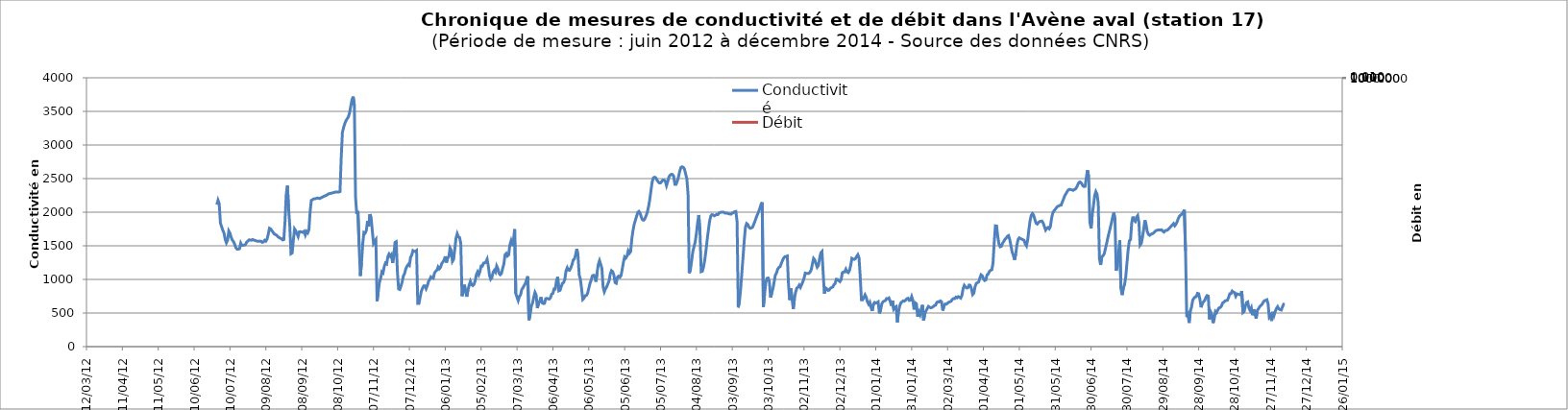
| Category | Conductivité |
|---|---|
| 41089.0 | 2112.5 |
| 41090.0 | 2178.333 |
| 41091.0 | 2126.875 |
| 41092.0 | 1839.931 |
| 41093.0 | 1784.757 |
| 41094.0 | 1731.042 |
| 41095.0 | 1690.625 |
| 41096.0 | 1595.417 |
| 41097.0 | 1543.75 |
| 41098.0 | 1582.292 |
| 41099.0 | 1719.618 |
| 41100.0 | 1686.667 |
| 41101.0 | 1625.833 |
| 41102.0 | 1583.958 |
| 41103.0 | 1561.25 |
| 41104.0 | 1518.542 |
| 41105.0 | 1469.097 |
| 41106.0 | 1449.931 |
| 41107.0 | 1450.833 |
| 41108.0 | 1456.667 |
| 41109.0 | 1540.208 |
| 41110.0 | 1505.625 |
| 41111.0 | 1508.125 |
| 41112.0 | 1510.208 |
| 41113.0 | 1519.167 |
| 41114.0 | 1555.833 |
| 41115.0 | 1571.667 |
| 41116.0 | 1588.125 |
| 41117.0 | 1587.083 |
| 41118.0 | 1582.917 |
| 41119.0 | 1594.167 |
| 41120.0 | 1585.208 |
| 41121.0 | 1579.375 |
| 41122.0 | 1572.917 |
| 41123.0 | 1568.75 |
| 41124.0 | 1567.5 |
| 41125.0 | 1569.792 |
| 41126.0 | 1567.5 |
| 41127.0 | 1551.667 |
| 41128.0 | 1557.014 |
| 41129.0 | 1582.708 |
| 41130.0 | 1569.792 |
| 41131.0 | 1600.208 |
| 41132.0 | 1669.792 |
| 41133.0 | 1761.25 |
| 41134.0 | 1752.083 |
| 41135.0 | 1726.667 |
| 41136.0 | 1701.25 |
| 41137.0 | 1675.833 |
| 41138.0 | 1666.528 |
| 41139.0 | 1657.917 |
| 41140.0 | 1635.833 |
| 41141.0 | 1624.583 |
| 41142.0 | 1612.292 |
| 41143.0 | 1605.833 |
| 41144.0 | 1586.875 |
| 41145.0 | 1592.5 |
| 41146.0 | 1858.368 |
| 41147.0 | 2256.563 |
| 41148.0 | 2394.583 |
| 41149.0 | 2060.434 |
| 41150.0 | 1798.958 |
| 41151.0 | 1381.615 |
| 41152.0 | 1393.542 |
| 41153.0 | 1583.542 |
| 41154.0 | 1751.042 |
| 41155.0 | 1723.75 |
| 41156.0 | 1680 |
| 41157.0 | 1637.5 |
| 41158.0 | 1708.542 |
| 41159.0 | 1710.208 |
| 41160.0 | 1705.833 |
| 41161.0 | 1698.542 |
| 41162.0 | 1714.792 |
| 41163.0 | 1660.625 |
| 41164.0 | 1713.75 |
| 41165.0 | 1692.708 |
| 41166.0 | 1738.958 |
| 41167.0 | 2005.833 |
| 41168.0 | 2175.625 |
| 41169.0 | 2186.042 |
| 41170.0 | 2197.708 |
| 41171.0 | 2200 |
| 41172.0 | 2203.958 |
| 41173.0 | 2210 |
| 41174.0 | 2209.167 |
| 41175.0 | 2203.125 |
| 41176.0 | 2212.938 |
| 41177.0 | 2221.326 |
| 41178.0 | 2231.285 |
| 41179.0 | 2240 |
| 41180.0 | 2246.875 |
| 41181.0 | 2255.104 |
| 41182.0 | 2268.708 |
| 41183.0 | 2276.458 |
| 41184.0 | 2279.167 |
| 41185.0 | 2283.542 |
| 41186.0 | 2290 |
| 41187.0 | 2292.292 |
| 41188.0 | 2300 |
| 41189.0 | 2300 |
| 41190.0 | 2300 |
| 41191.0 | 2300 |
| 41192.0 | 2305.625 |
| 41193.0 | 2809.688 |
| 41194.0 | 3186.25 |
| 41195.0 | 3260 |
| 41196.0 | 3318.333 |
| 41197.0 | 3362.083 |
| 41198.0 | 3390.365 |
| 41199.0 | 3417.472 |
| 41200.0 | 3478.25 |
| 41201.0 | 3577.76 |
| 41202.0 | 3672.625 |
| 41203.0 | 3719.299 |
| 41204.0 | 3589.92 |
| 41205.0 | 2224.059 |
| 41206.0 | 1971.389 |
| 41207.0 | 2018.199 |
| 41208.0 | 1494.351 |
| 41209.0 | 1051.669 |
| 41210.0 | 1250.556 |
| 41211.0 | 1528.684 |
| 41212.0 | 1698.892 |
| 41213.0 | 1688.899 |
| 41214.0 | 1726.299 |
| 41215.0 | 1868.75 |
| 41216.0 | 1786.354 |
| 41217.0 | 1970.201 |
| 41218.0 | 1916.861 |
| 41219.0 | 1727.111 |
| 41220.0 | 1534.74 |
| 41221.0 | 1566.639 |
| 41222.0 | 1592.714 |
| 41223.0 | 676.675 |
| 41224.0 | 827.188 |
| 41225.0 | 957.142 |
| 41226.0 | 1018.222 |
| 41227.0 | 1113.722 |
| 41228.0 | 1097.228 |
| 41229.0 | 1194.022 |
| 41230.0 | 1243.189 |
| 41231.0 | 1230 |
| 41232.0 | 1340.139 |
| 41233.0 | 1376.944 |
| 41234.0 | 1345.15 |
| 41235.0 | 1369.855 |
| 41236.0 | 1244.172 |
| 41237.0 | 1355.139 |
| 41238.0 | 1551.389 |
| 41239.0 | 1561.574 |
| 41240.0 | 1109.032 |
| 41241.0 | 857.31 |
| 41242.0 | 850.481 |
| 41243.0 | 904.45 |
| 41244.0 | 965 |
| 41245.0 | 1051.855 |
| 41246.0 | 1085.22 |
| 41247.0 | 1157.627 |
| 41248.0 | 1194.722 |
| 41249.0 | 1222.083 |
| 41250.0 | 1207.818 |
| 41251.0 | 1329.041 |
| 41252.0 | 1361.258 |
| 41253.0 | 1428.605 |
| 41254.0 | 1417.506 |
| 41255.0 | 1416.806 |
| 41256.0 | 1430.365 |
| 41257.0 | 643.125 |
| 41258.0 | 643.021 |
| 41259.0 | 734.375 |
| 41260.0 | 825.833 |
| 41261.0 | 869.097 |
| 41262.0 | 903.333 |
| 41263.0 | 903.299 |
| 41264.0 | 861.25 |
| 41265.0 | 905 |
| 41266.0 | 970.833 |
| 41267.0 | 997.917 |
| 41268.0 | 1037.917 |
| 41269.0 | 1024.167 |
| 41270.0 | 1017.587 |
| 41271.0 | 1093.958 |
| 41272.0 | 1122.292 |
| 41273.0 | 1138.958 |
| 41274.0 | 1185.625 |
| 41275.0 | 1156.458 |
| 41276.0 | 1177.292 |
| 41277.0 | 1234.375 |
| 41278.0 | 1258.542 |
| 41279.0 | 1288.125 |
| 41280.0 | 1342.083 |
| 41281.0 | 1251.458 |
| 41282.0 | 1316.667 |
| 41283.0 | 1341.667 |
| 41284.0 | 1467.378 |
| 41285.0 | 1431.875 |
| 41286.0 | 1268.75 |
| 41287.0 | 1298.333 |
| 41288.0 | 1452.917 |
| 41289.0 | 1613.75 |
| 41290.0 | 1679.792 |
| 41291.0 | 1633.958 |
| 41292.0 | 1622.708 |
| 41293.0 | 1533.16 |
| 41294.0 | 751.302 |
| 41295.0 | 815.208 |
| 41296.0 | 920.503 |
| 41297.0 | 818.472 |
| 41298.0 | 743.021 |
| 41299.0 | 844.67 |
| 41300.0 | 913.958 |
| 41301.0 | 969.948 |
| 41302.0 | 921.181 |
| 41303.0 | 908.125 |
| 41304.0 | 927.083 |
| 41305.0 | 978.333 |
| 41306.0 | 1069.375 |
| 41307.0 | 1110.764 |
| 41308.0 | 1069.167 |
| 41309.0 | 1117.5 |
| 41310.0 | 1198.75 |
| 41311.0 | 1197.083 |
| 41312.0 | 1242.292 |
| 41313.0 | 1244.583 |
| 41314.0 | 1261.875 |
| 41315.0 | 1300.833 |
| 41316.0 | 1200.573 |
| 41317.0 | 1061.042 |
| 41318.0 | 1003.125 |
| 41319.0 | 1026.667 |
| 41320.0 | 1105 |
| 41321.0 | 1135 |
| 41322.0 | 1109.167 |
| 41323.0 | 1199.583 |
| 41324.0 | 1161.458 |
| 41325.0 | 1089.375 |
| 41326.0 | 1069.792 |
| 41327.0 | 1088.958 |
| 41328.0 | 1163.75 |
| 41329.0 | 1228.125 |
| 41330.0 | 1365.833 |
| 41331.0 | 1385.417 |
| 41332.0 | 1347.5 |
| 41333.0 | 1363.958 |
| 41334.0 | 1510.99 |
| 41335.0 | 1570.729 |
| 41336.0 | 1496.719 |
| 41337.0 | 1573.854 |
| 41338.0 | 1746.736 |
| 41339.0 | 791.007 |
| 41340.0 | 736.198 |
| 41341.0 | 685.035 |
| 41342.0 | 747.083 |
| 41343.0 | 771.307 |
| 41344.0 | 851.992 |
| 41345.0 | 875.052 |
| 41346.0 | 910.052 |
| 41347.0 | 937.465 |
| 41348.0 | 999.219 |
| 41349.0 | 1045.503 |
| 41350.0 | 394.201 |
| 41351.0 | 476.545 |
| 41352.0 | 603.698 |
| 41353.0 | 648.038 |
| 41354.0 | 734.948 |
| 41355.0 | 807.083 |
| 41356.0 | 769.708 |
| 41357.0 | 574.128 |
| 41358.0 | 643.75 |
| 41359.0 | 675.885 |
| 41360.0 | 736.563 |
| 41361.0 | 652.24 |
| 41362.0 | 640.781 |
| 41363.0 | 644.635 |
| 41364.0 | 713.924 |
| 41365.0 | 718.385 |
| 41366.0 | 710.417 |
| 41367.0 | 707.5 |
| 41368.0 | 727.083 |
| 41369.0 | 781.302 |
| 41370.0 | 792.448 |
| 41371.0 | 858.698 |
| 41372.0 | 857.552 |
| 41373.0 | 980.885 |
| 41374.0 | 1037.344 |
| 41375.0 | 830.104 |
| 41376.0 | 838.038 |
| 41377.0 | 894.063 |
| 41378.0 | 941.667 |
| 41379.0 | 954.635 |
| 41380.0 | 1002.292 |
| 41381.0 | 1130 |
| 41382.0 | 1174.583 |
| 41383.0 | 1138.281 |
| 41384.0 | 1136.667 |
| 41385.0 | 1172.083 |
| 41386.0 | 1222.083 |
| 41387.0 | 1287.917 |
| 41388.0 | 1305.104 |
| 41389.0 | 1367.031 |
| 41390.0 | 1454.115 |
| 41391.0 | 1349.549 |
| 41392.0 | 1066.337 |
| 41393.0 | 1000.781 |
| 41394.0 | 859.826 |
| 41395.0 | 701.094 |
| 41396.0 | 719.948 |
| 41397.0 | 757.5 |
| 41398.0 | 761.615 |
| 41399.0 | 791.545 |
| 41400.0 | 864.688 |
| 41401.0 | 938.594 |
| 41402.0 | 988.559 |
| 41403.0 | 1052.448 |
| 41404.0 | 1062.083 |
| 41405.0 | 1048.333 |
| 41406.0 | 965.885 |
| 41407.0 | 1104.099 |
| 41408.0 | 1224.999 |
| 41409.0 | 1278.858 |
| 41410.0 | 1224.527 |
| 41411.0 | 1160.799 |
| 41412.0 | 886.01 |
| 41413.0 | 816.214 |
| 41414.0 | 860.762 |
| 41415.0 | 890.589 |
| 41416.0 | 934.515 |
| 41417.0 | 979.795 |
| 41418.0 | 1081.351 |
| 41419.0 | 1130.625 |
| 41420.0 | 1114.721 |
| 41421.0 | 1066.043 |
| 41422.0 | 952.292 |
| 41423.0 | 942.92 |
| 41424.0 | 1034.303 |
| 41425.0 | 1048.993 |
| 41426.0 | 1031.63 |
| 41427.0 | 1056.565 |
| 41428.0 | 1153.264 |
| 41429.0 | 1257.846 |
| 41430.0 | 1335.884 |
| 41431.0 | 1319.081 |
| 41432.0 | 1347.5 |
| 41433.0 | 1424.29 |
| 41434.0 | 1389.529 |
| 41435.0 | 1413.333 |
| 41436.0 | 1604.688 |
| 41437.0 | 1729.463 |
| 41438.0 | 1820.658 |
| 41439.0 | 1880.556 |
| 41440.0 | 1939.897 |
| 41441.0 | 1997.95 |
| 41442.0 | 2011.285 |
| 41443.0 | 1981.493 |
| 41444.0 | 1923.125 |
| 41445.0 | 1885.903 |
| 41446.0 | 1881.701 |
| 41447.0 | 1905.556 |
| 41448.0 | 1949.758 |
| 41449.0 | 2002.743 |
| 41450.0 | 2084.028 |
| 41451.0 | 2186.321 |
| 41452.0 | 2322.153 |
| 41453.0 | 2446.978 |
| 41454.0 | 2510.901 |
| 41455.0 | 2520.904 |
| 41456.0 | 2512.742 |
| 41457.0 | 2479.374 |
| 41458.0 | 2454.376 |
| 41459.0 | 2434.549 |
| 41460.0 | 2435.035 |
| 41461.0 | 2457.986 |
| 41462.0 | 2477.951 |
| 41463.0 | 2475.99 |
| 41464.0 | 2460.978 |
| 41465.0 | 2396 |
| 41466.0 | 2453.18 |
| 41467.0 | 2523.054 |
| 41468.0 | 2550.901 |
| 41469.0 | 2563.751 |
| 41470.0 | 2561.667 |
| 41471.0 | 2534.861 |
| 41472.0 | 2415.663 |
| 41473.0 | 2414.271 |
| 41474.0 | 2461.594 |
| 41475.0 | 2522.83 |
| 41476.0 | 2604.932 |
| 41477.0 | 2663.818 |
| 41478.0 | 2675.661 |
| 41479.0 | 2668.228 |
| 41480.0 | 2641.944 |
| 41481.0 | 2568.922 |
| 41482.0 | 2498.194 |
| 41483.0 | 2272.623 |
| 41484.0 | 1093.526 |
| 41485.0 | 1143.887 |
| 41486.0 | 1274.342 |
| 41487.0 | 1412.707 |
| 41488.0 | 1487.326 |
| 41489.0 | 1556.946 |
| 41490.0 | 1682.986 |
| 41491.0 | 1839.757 |
| 41492.0 | 1958.037 |
| 41493.0 | 1693.243 |
| 41494.0 | 1115.769 |
| 41495.0 | 1122.603 |
| 41496.0 | 1187.24 |
| 41497.0 | 1291.321 |
| 41498.0 | 1428.385 |
| 41499.0 | 1588.715 |
| 41500.0 | 1730.868 |
| 41501.0 | 1862.065 |
| 41502.0 | 1942.083 |
| 41503.0 | 1964.929 |
| 41504.0 | 1957.572 |
| 41505.0 | 1946.007 |
| 41506.0 | 1958.714 |
| 41507.0 | 1966.701 |
| 41508.0 | 1964.618 |
| 41509.0 | 1988.819 |
| 41510.0 | 1997.118 |
| 41511.0 | 1999.62 |
| 41512.0 | 2002.047 |
| 41513.0 | 1998.056 |
| 41514.0 | 1987.083 |
| 41515.0 | 1986.667 |
| 41516.0 | 1984.132 |
| 41517.0 | 1977.429 |
| 41518.0 | 1972.953 |
| 41519.0 | 1970.868 |
| 41520.0 | 1987.951 |
| 41521.0 | 1992.951 |
| 41522.0 | 2008.368 |
| 41523.0 | 2011.285 |
| 41524.0 | 1860.208 |
| 41525.0 | 583.109 |
| 41526.0 | 677.674 |
| 41527.0 | 859.429 |
| 41528.0 | 1096.387 |
| 41529.0 | 1330.903 |
| 41530.0 | 1577.606 |
| 41531.0 | 1776.56 |
| 41532.0 | 1831.319 |
| 41533.0 | 1817.326 |
| 41534.0 | 1777.813 |
| 41535.0 | 1760.833 |
| 41536.0 | 1766.214 |
| 41537.0 | 1778.128 |
| 41538.0 | 1822.499 |
| 41539.0 | 1867.293 |
| 41540.0 | 1920.016 |
| 41541.0 | 1963.126 |
| 41542.0 | 2005.485 |
| 41543.0 | 2055.208 |
| 41544.0 | 2113.194 |
| 41545.0 | 2147.465 |
| 41546.0 | 589.499 |
| 41547.0 | 780.988 |
| 41548.0 | 952.342 |
| 41549.0 | 1016.005 |
| 41550.0 | 1020.765 |
| 41551.0 | 972.438 |
| 41552.0 | 731.191 |
| 41553.0 | 796.564 |
| 41554.0 | 864.028 |
| 41555.0 | 962.36 |
| 41556.0 | 1063.958 |
| 41557.0 | 1097.083 |
| 41558.0 | 1152.917 |
| 41559.0 | 1178.75 |
| 41560.0 | 1189.219 |
| 41561.0 | 1238.281 |
| 41562.0 | 1282.083 |
| 41563.0 | 1317.917 |
| 41564.0 | 1338.75 |
| 41565.0 | 1340.417 |
| 41566.0 | 1347.552 |
| 41567.0 | 927.066 |
| 41568.0 | 693.889 |
| 41569.0 | 865.308 |
| 41570.0 | 705.855 |
| 41571.0 | 560.208 |
| 41572.0 | 718.385 |
| 41573.0 | 813.698 |
| 41574.0 | 871.667 |
| 41575.0 | 884.236 |
| 41576.0 | 914.948 |
| 41577.0 | 881.719 |
| 41578.0 | 922.5 |
| 41579.0 | 964.948 |
| 41580.0 | 1017.188 |
| 41581.0 | 1093.646 |
| 41582.0 | 1088.75 |
| 41583.0 | 1089.583 |
| 41584.0 | 1089.531 |
| 41585.0 | 1108.385 |
| 41586.0 | 1142.917 |
| 41587.0 | 1230.417 |
| 41588.0 | 1311.667 |
| 41589.0 | 1289.583 |
| 41590.0 | 1236.198 |
| 41591.0 | 1181.719 |
| 41592.0 | 1206.163 |
| 41593.0 | 1311.615 |
| 41594.0 | 1394.583 |
| 41595.0 | 1415 |
| 41596.0 | 1095.833 |
| 41597.0 | 790.365 |
| 41598.0 | 873.715 |
| 41599.0 | 860.833 |
| 41600.0 | 836.25 |
| 41601.0 | 840.885 |
| 41602.0 | 868.698 |
| 41603.0 | 879.132 |
| 41604.0 | 887.049 |
| 41605.0 | 922.865 |
| 41606.0 | 940 |
| 41607.0 | 1002.917 |
| 41608.0 | 1000 |
| 41609.0 | 982.083 |
| 41610.0 | 967.083 |
| 41611.0 | 995.469 |
| 41612.0 | 1098.698 |
| 41613.0 | 1111.667 |
| 41614.0 | 1110.833 |
| 41615.0 | 1152.031 |
| 41616.0 | 1113.385 |
| 41617.0 | 1101.667 |
| 41618.0 | 1133.75 |
| 41619.0 | 1207.917 |
| 41620.0 | 1312.917 |
| 41621.0 | 1301.667 |
| 41622.0 | 1297.917 |
| 41623.0 | 1309.67 |
| 41624.0 | 1342.969 |
| 41625.0 | 1367.865 |
| 41626.0 | 1319.514 |
| 41627.0 | 1030.92 |
| 41628.0 | 696.198 |
| 41629.0 | 696.302 |
| 41630.0 | 729.167 |
| 41631.0 | 770.417 |
| 41632.0 | 734.601 |
| 41633.0 | 665.885 |
| 41634.0 | 630.885 |
| 41635.0 | 660.365 |
| 41636.0 | 585.755 |
| 41637.0 | 530.686 |
| 41638.0 | 631.823 |
| 41639.0 | 657.448 |
| 41640.0 | 648.368 |
| 41641.0 | 655 |
| 41642.0 | 666.615 |
| 41643.0 | 494.826 |
| 41644.0 | 541.389 |
| 41645.0 | 634.601 |
| 41646.0 | 667.5 |
| 41647.0 | 677.083 |
| 41648.0 | 684.792 |
| 41649.0 | 715.556 |
| 41650.0 | 710.509 |
| 41651.0 | 723.241 |
| 41652.0 | 675.978 |
| 41653.0 | 607.824 |
| 41654.0 | 685.116 |
| 41655.0 | 557.946 |
| 41656.0 | 581.435 |
| 41657.0 | 594.449 |
| 41658.0 | 360.62 |
| 41659.0 | 524.097 |
| 41660.0 | 605.556 |
| 41661.0 | 652.569 |
| 41662.0 | 667.153 |
| 41663.0 | 681.991 |
| 41664.0 | 677.106 |
| 41665.0 | 692.361 |
| 41666.0 | 712.708 |
| 41667.0 | 719.375 |
| 41668.0 | 687.708 |
| 41669.0 | 691.343 |
| 41670.0 | 743.519 |
| 41671.0 | 687.436 |
| 41672.0 | 552.546 |
| 41673.0 | 651.667 |
| 41674.0 | 636.574 |
| 41675.0 | 446.348 |
| 41676.0 | 517.662 |
| 41677.0 | 475.81 |
| 41678.0 | 560.671 |
| 41679.0 | 620.069 |
| 41680.0 | 390.764 |
| 41681.0 | 489.115 |
| 41682.0 | 532.292 |
| 41683.0 | 563.403 |
| 41684.0 | 598.287 |
| 41685.0 | 586.435 |
| 41686.0 | 577.014 |
| 41687.0 | 583.681 |
| 41688.0 | 595 |
| 41689.0 | 612.708 |
| 41690.0 | 616.389 |
| 41691.0 | 657.917 |
| 41692.0 | 667.847 |
| 41693.0 | 664.514 |
| 41694.0 | 680.37 |
| 41695.0 | 667.72 |
| 41696.0 | 536.829 |
| 41697.0 | 603.727 |
| 41698.0 | 634.19 |
| 41699.0 | 631.505 |
| 41700.0 | 645.787 |
| 41701.0 | 661.435 |
| 41702.0 | 667.569 |
| 41703.0 | 675.625 |
| 41704.0 | 703.611 |
| 41705.0 | 715.556 |
| 41706.0 | 715.139 |
| 41707.0 | 737.083 |
| 41708.0 | 726.181 |
| 41709.0 | 743.681 |
| 41710.0 | 735.208 |
| 41711.0 | 721.759 |
| 41712.0 | 759.144 |
| 41713.0 | 861.667 |
| 41714.0 | 911.042 |
| 41715.0 | 885.625 |
| 41716.0 | 872.5 |
| 41717.0 | 876.458 |
| 41718.0 | 916.042 |
| 41719.0 | 912.292 |
| 41720.0 | 859.705 |
| 41721.0 | 775.208 |
| 41722.0 | 797.292 |
| 41723.0 | 892.083 |
| 41724.0 | 939.167 |
| 41725.0 | 951.875 |
| 41726.0 | 961.25 |
| 41727.0 | 1020.208 |
| 41728.0 | 1068.958 |
| 41729.0 | 1054.583 |
| 41730.0 | 1011.25 |
| 41731.0 | 983.542 |
| 41732.0 | 991.458 |
| 41733.0 | 1066.042 |
| 41734.0 | 1080.417 |
| 41735.0 | 1117.5 |
| 41736.0 | 1135.208 |
| 41737.0 | 1143.333 |
| 41738.0 | 1238.333 |
| 41739.0 | 1543.333 |
| 41740.0 | 1797.083 |
| 41741.0 | 1794.792 |
| 41742.0 | 1639.167 |
| 41743.0 | 1526.667 |
| 41744.0 | 1485.417 |
| 41745.0 | 1492.292 |
| 41746.0 | 1538.958 |
| 41747.0 | 1563.75 |
| 41748.0 | 1597.083 |
| 41749.0 | 1615 |
| 41750.0 | 1641.042 |
| 41751.0 | 1651.875 |
| 41752.0 | 1591.667 |
| 41753.0 | 1502.292 |
| 41754.0 | 1407.031 |
| 41755.0 | 1360.625 |
| 41756.0 | 1291.042 |
| 41757.0 | 1374.792 |
| 41758.0 | 1511.667 |
| 41759.0 | 1594.792 |
| 41760.0 | 1618.542 |
| 41761.0 | 1607.708 |
| 41762.0 | 1600.625 |
| 41763.0 | 1590 |
| 41764.0 | 1582.292 |
| 41765.0 | 1527.5 |
| 41766.0 | 1499.167 |
| 41767.0 | 1587.708 |
| 41768.0 | 1739.167 |
| 41769.0 | 1874.583 |
| 41770.0 | 1953.333 |
| 41771.0 | 1980 |
| 41772.0 | 1955.625 |
| 41773.0 | 1891.875 |
| 41774.0 | 1836.667 |
| 41775.0 | 1823.333 |
| 41776.0 | 1845 |
| 41777.0 | 1860.417 |
| 41778.0 | 1866.042 |
| 41779.0 | 1866.875 |
| 41780.0 | 1837.083 |
| 41781.0 | 1785 |
| 41782.0 | 1734.792 |
| 41783.0 | 1761.458 |
| 41784.0 | 1772.5 |
| 41785.0 | 1753.854 |
| 41786.0 | 1788.438 |
| 41787.0 | 1913.646 |
| 41788.0 | 1988.385 |
| 41789.0 | 2021.25 |
| 41790.0 | 2041.198 |
| 41791.0 | 2065.885 |
| 41792.0 | 2084.948 |
| 41793.0 | 2092.5 |
| 41794.0 | 2103.333 |
| 41795.0 | 2105.469 |
| 41796.0 | 2152.865 |
| 41797.0 | 2196.667 |
| 41798.0 | 2244.167 |
| 41799.0 | 2274.583 |
| 41800.0 | 2305.417 |
| 41801.0 | 2331.667 |
| 41802.0 | 2340.417 |
| 41803.0 | 2335.885 |
| 41804.0 | 2332.448 |
| 41805.0 | 2325 |
| 41806.0 | 2335.833 |
| 41807.0 | 2346.25 |
| 41808.0 | 2372.135 |
| 41809.0 | 2412.5 |
| 41810.0 | 2444.583 |
| 41811.0 | 2449.479 |
| 41812.0 | 2431.719 |
| 41813.0 | 2396.198 |
| 41814.0 | 2381.771 |
| 41815.0 | 2384.444 |
| 41816.0 | 2507.24 |
| 41817.0 | 2625.104 |
| 41818.0 | 2529.311 |
| 41819.0 | 1851.73 |
| 41820.0 | 1759.948 |
| 41821.0 | 1970.417 |
| 41822.0 | 2095.052 |
| 41823.0 | 2246.667 |
| 41824.0 | 2305.208 |
| 41825.0 | 2266.875 |
| 41826.0 | 2135.295 |
| 41827.0 | 1311.667 |
| 41828.0 | 1214.792 |
| 41829.0 | 1338.75 |
| 41830.0 | 1352.5 |
| 41831.0 | 1380.625 |
| 41832.0 | 1456.875 |
| 41833.0 | 1533.125 |
| 41834.0 | 1617.292 |
| 41835.0 | 1691.667 |
| 41836.0 | 1764.792 |
| 41837.0 | 1838.333 |
| 41838.0 | 1923.142 |
| 41839.0 | 1993.958 |
| 41840.0 | 1899.444 |
| 41841.0 | 1129.184 |
| 41842.0 | 1202.708 |
| 41843.0 | 1388.264 |
| 41844.0 | 1582.118 |
| 41845.0 | 864.983 |
| 41846.0 | 767.917 |
| 41847.0 | 874.583 |
| 41848.0 | 919.375 |
| 41849.0 | 1038.125 |
| 41850.0 | 1241.771 |
| 41851.0 | 1439.774 |
| 41852.0 | 1573.75 |
| 41853.0 | 1591.997 |
| 41854.0 | 1842.708 |
| 41855.0 | 1934.167 |
| 41856.0 | 1877.083 |
| 41857.0 | 1861.458 |
| 41858.0 | 1925.556 |
| 41859.0 | 1950.278 |
| 41860.0 | 1845.885 |
| 41861.0 | 1509.375 |
| 41862.0 | 1533.333 |
| 41863.0 | 1627.5 |
| 41864.0 | 1743.003 |
| 41865.0 | 1879.375 |
| 41866.0 | 1816.042 |
| 41867.0 | 1712.292 |
| 41868.0 | 1669.792 |
| 41869.0 | 1656.059 |
| 41870.0 | 1670 |
| 41871.0 | 1677.917 |
| 41872.0 | 1687.917 |
| 41873.0 | 1703.75 |
| 41874.0 | 1722.882 |
| 41875.0 | 1731.042 |
| 41876.0 | 1734.792 |
| 41877.0 | 1736.25 |
| 41878.0 | 1736.042 |
| 41879.0 | 1738.125 |
| 41880.0 | 1715.66 |
| 41881.0 | 1704.583 |
| 41882.0 | 1726.25 |
| 41883.0 | 1728.125 |
| 41884.0 | 1734.792 |
| 41885.0 | 1752.049 |
| 41886.0 | 1770.417 |
| 41887.0 | 1793.75 |
| 41888.0 | 1811.667 |
| 41889.0 | 1830.417 |
| 41890.0 | 1798.177 |
| 41891.0 | 1820.625 |
| 41892.0 | 1859.792 |
| 41893.0 | 1909.375 |
| 41894.0 | 1942.083 |
| 41895.0 | 1959.375 |
| 41896.0 | 1970 |
| 41897.0 | 2001.042 |
| 41898.0 | 2035.625 |
| 41899.0 | 1423.594 |
| 41900.0 | 440.347 |
| 41901.0 | 475.972 |
| 41902.0 | 353.663 |
| 41903.0 | 533.194 |
| 41904.0 | 585.608 |
| 41905.0 | 690.625 |
| 41906.0 | 719.323 |
| 41907.0 | 740.035 |
| 41908.0 | 745.625 |
| 41909.0 | 792.708 |
| 41910.0 | 786.667 |
| 41911.0 | 705.226 |
| 41912.0 | 584.635 |
| 41913.0 | 643.333 |
| 41914.0 | 666.042 |
| 41915.0 | 686.875 |
| 41916.0 | 732.083 |
| 41917.0 | 759.375 |
| 41918.0 | 752.396 |
| 41919.0 | 406.84 |
| 41920.0 | 517.483 |
| 41921.0 | 476.91 |
| 41922.0 | 351.198 |
| 41923.0 | 417.639 |
| 41924.0 | 524.74 |
| 41925.0 | 506.615 |
| 41926.0 | 546.771 |
| 41927.0 | 576.111 |
| 41928.0 | 581.875 |
| 41929.0 | 603.333 |
| 41930.0 | 649.375 |
| 41931.0 | 661.667 |
| 41932.0 | 680 |
| 41933.0 | 686.91 |
| 41934.0 | 689.149 |
| 41935.0 | 733.576 |
| 41936.0 | 786.667 |
| 41937.0 | 787.917 |
| 41938.0 | 826.667 |
| 41939.0 | 811.458 |
| 41940.0 | 802.5 |
| 41941.0 | 750.625 |
| 41942.0 | 784.792 |
| 41943.0 | 780.208 |
| 41944.0 | 773.542 |
| 41945.0 | 769.375 |
| 41946.0 | 827.726 |
| 41947.0 | 506.441 |
| 41948.0 | 521.267 |
| 41949.0 | 601.51 |
| 41950.0 | 655.26 |
| 41951.0 | 665.139 |
| 41952.0 | 574.757 |
| 41953.0 | 537.517 |
| 41954.0 | 577.5 |
| 41955.0 | 467.813 |
| 41956.0 | 555.243 |
| 41957.0 | 496.024 |
| 41958.0 | 416.285 |
| 41959.0 | 539.028 |
| 41960.0 | 564.375 |
| 41961.0 | 594.167 |
| 41962.0 | 612.292 |
| 41963.0 | 629.375 |
| 41964.0 | 661.875 |
| 41965.0 | 684.167 |
| 41966.0 | 687.708 |
| 41967.0 | 697.292 |
| 41968.0 | 638.737 |
| 41969.0 | 438.681 |
| 41970.0 | 463.294 |
| 41971.0 | 382.969 |
| 41972.0 | 517.5 |
| 41973.0 | 466.263 |
| 41974.0 | 524.362 |
| 41975.0 | 568.438 |
| 41976.0 | 594.839 |
| 41977.0 | 561.393 |
| 41978.0 | 550.59 |
| 41979.0 | 544.457 |
| 41980.0 | 589.466 |
| 41981.0 | 630.521 |
| 41982.0 | 628.546 |